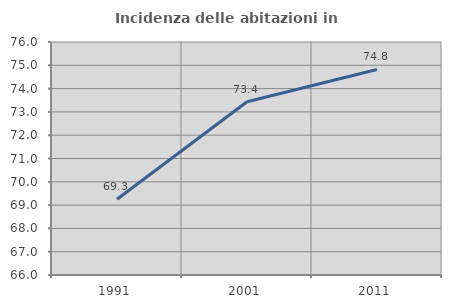
| Category | Incidenza delle abitazioni in proprietà  |
|---|---|
| 1991.0 | 69.252 |
| 2001.0 | 73.436 |
| 2011.0 | 74.821 |